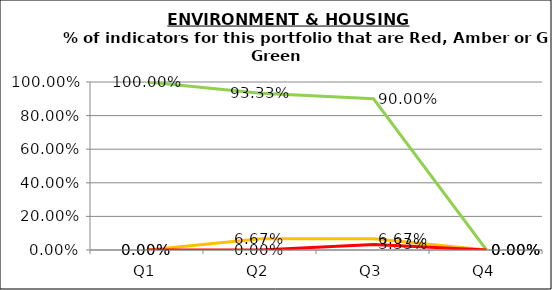
| Category | Green | Amber | Red |
|---|---|---|---|
| Q1 | 1 | 0 | 0 |
| Q2 | 0.933 | 0.067 | 0 |
| Q3 | 0.9 | 0.067 | 0.033 |
| Q4 | 0 | 0 | 0 |